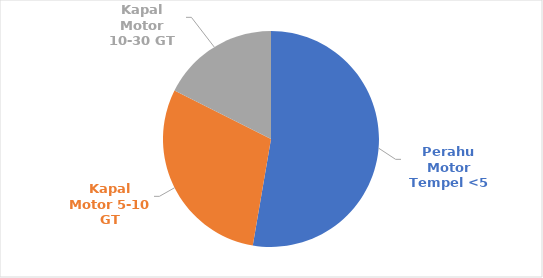
| Category | PP Muncar  |
|---|---|
| Perahu Motor Tempel <5 | 566 |
| Kapal Motor 5-10 GT | 319 |
| Kapal Motor 10-30 GT | 189 |